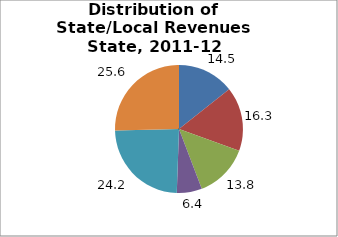
| Category | Series 0 |
|---|---|
| General Sales | 14.452 |
| Property | 16.347 |
| Income1 | 13.779 |
| Other | 6.398 |
| From Federal Government | 24.24 |
| Nontax Revenues2 | 25.612 |